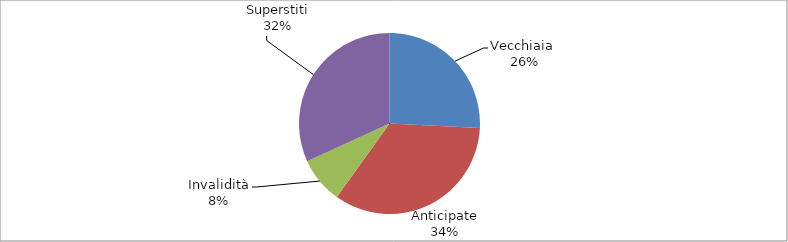
| Category | Series 0 |
|---|---|
| Vecchiaia  | 42999 |
| Anticipate | 56801 |
| Invalidità | 13814 |
| Superstiti | 53038 |